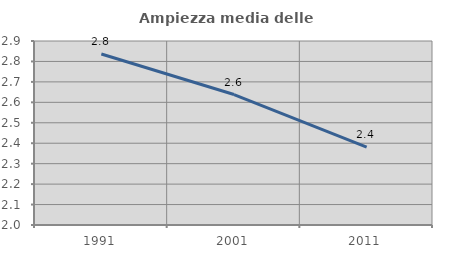
| Category | Ampiezza media delle famiglie |
|---|---|
| 1991.0 | 2.836 |
| 2001.0 | 2.638 |
| 2011.0 | 2.381 |